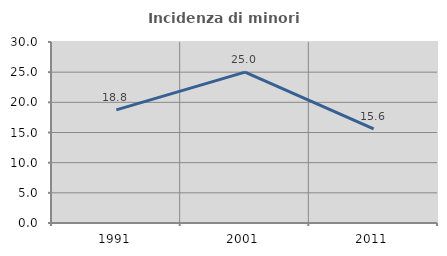
| Category | Incidenza di minori stranieri |
|---|---|
| 1991.0 | 18.75 |
| 2001.0 | 25 |
| 2011.0 | 15.584 |